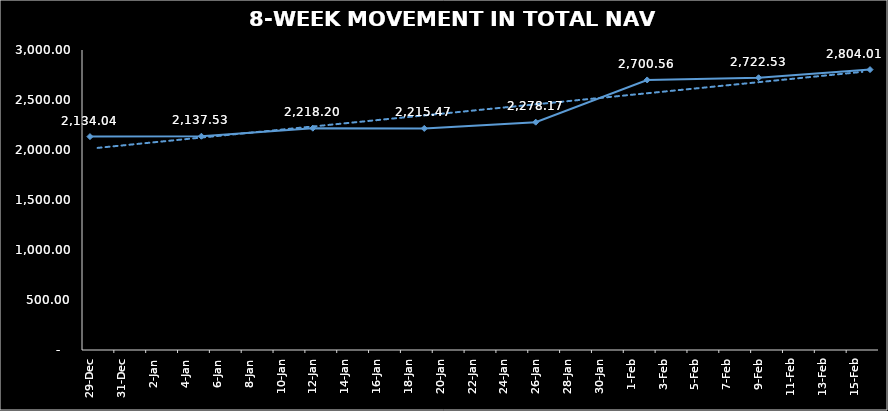
| Category | TOTAL NAV |
|---|---|
| 2023-12-29 | 2134.045 |
| 2024-01-05 | 2137.525 |
| 2024-01-12 | 2218.205 |
| 2024-01-19 | 2215.471 |
| 2024-01-26 | 2278.172 |
| 2024-02-02 | 2700.559 |
| 2024-02-09 | 2722.532 |
| 2024-02-16 | 2804.014 |